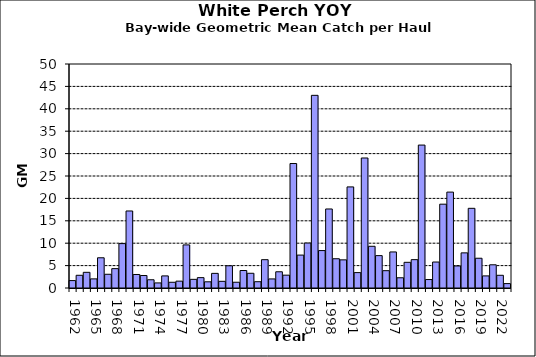
| Category | Series 0 |
|---|---|
| 1962.0 | 1.655 |
| 1963.0 | 2.837 |
| 1964.0 | 3.5 |
| 1965.0 | 2.034 |
| 1966.0 | 6.746 |
| 1967.0 | 3.064 |
| 1968.0 | 4.323 |
| 1969.0 | 9.912 |
| 1970.0 | 17.192 |
| 1971.0 | 3.014 |
| 1972.0 | 2.786 |
| 1973.0 | 1.84 |
| 1974.0 | 1.135 |
| 1975.0 | 2.702 |
| 1976.0 | 1.277 |
| 1977.0 | 1.529 |
| 1978.0 | 9.623 |
| 1979.0 | 1.931 |
| 1980.0 | 2.314 |
| 1981.0 | 1.382 |
| 1982.0 | 3.265 |
| 1983.0 | 1.492 |
| 1984.0 | 4.961 |
| 1985.0 | 1.286 |
| 1986.0 | 3.905 |
| 1987.0 | 3.288 |
| 1988.0 | 1.403 |
| 1989.0 | 6.322 |
| 1990.0 | 2.025 |
| 1991.0 | 3.622 |
| 1992.0 | 2.866 |
| 1993.0 | 27.786 |
| 1994.0 | 7.346 |
| 1995.0 | 10.04 |
| 1996.0 | 43.006 |
| 1997.0 | 8.355 |
| 1998.0 | 17.639 |
| 1999.0 | 6.53 |
| 2000.0 | 6.285 |
| 2001.0 | 22.564 |
| 2002.0 | 3.436 |
| 2003.0 | 29.019 |
| 2004.0 | 9.31 |
| 2005.0 | 7.228 |
| 2006.0 | 3.868 |
| 2007.0 | 8.046 |
| 2008.0 | 2.283 |
| 2009.0 | 5.732 |
| 2010.0 | 6.33 |
| 2011.0 | 31.904 |
| 2012.0 | 1.89 |
| 2013.0 | 5.8 |
| 2014.0 | 18.708 |
| 2015.0 | 21.406 |
| 2016.0 | 4.919 |
| 2017.0 | 7.842 |
| 2018.0 | 17.786 |
| 2019.0 | 6.642 |
| 2020.0 | 2.7 |
| 2021.0 | 5.181 |
| 2022.0 | 2.837 |
| 2023.0 | 0.981 |